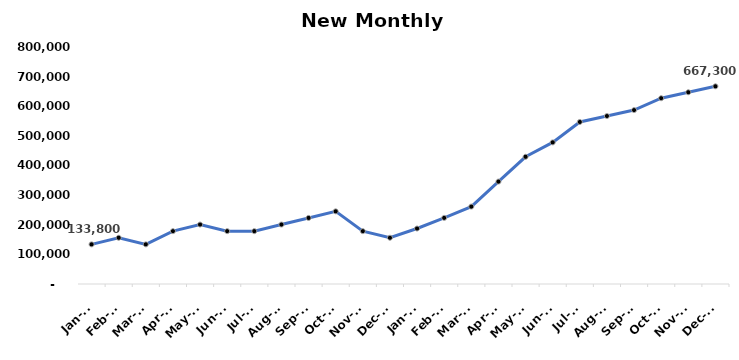
| Category | New ARR |
|---|---|
| 2023-01-31 | 133800 |
| 2023-02-28 | 156100 |
| 2023-03-31 | 133800 |
| 2023-04-30 | 178400 |
| 2023-05-31 | 200700 |
| 2023-06-30 | 178400 |
| 2023-07-31 | 178400 |
| 2023-08-31 | 200700 |
| 2023-09-30 | 223000 |
| 2023-10-31 | 245300 |
| 2023-11-30 | 178400 |
| 2023-12-31 | 156100 |
| 2024-01-31 | 187280 |
| 2024-02-29 | 223200 |
| 2024-03-31 | 261280 |
| 2024-04-30 | 345700 |
| 2024-05-31 | 429400 |
| 2024-06-30 | 478020 |
| 2024-07-31 | 546940 |
| 2024-08-31 | 567000 |
| 2024-09-30 | 587060 |
| 2024-10-31 | 627180 |
| 2024-11-30 | 647240 |
| 2024-12-31 | 667300 |